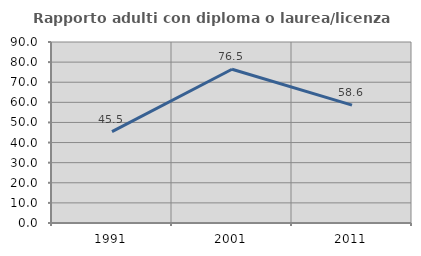
| Category | Rapporto adulti con diploma o laurea/licenza media  |
|---|---|
| 1991.0 | 45.455 |
| 2001.0 | 76.471 |
| 2011.0 | 58.621 |